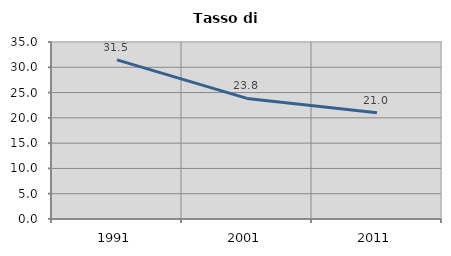
| Category | Tasso di disoccupazione   |
|---|---|
| 1991.0 | 31.475 |
| 2001.0 | 23.849 |
| 2011.0 | 21.016 |